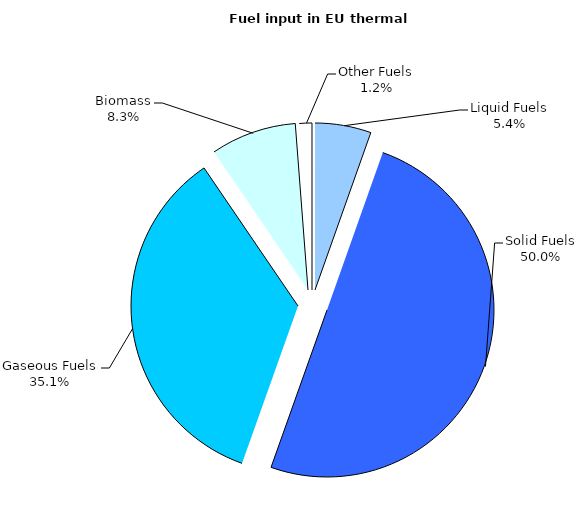
| Category | Series 0 |
|---|---|
| Liquid Fuels | 892904 |
| Solid Fuels | 8235379 |
| Gaseous Fuels | 5771264 |
| Biomass | 1365956 |
| Other Fuels | 200258 |